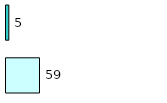
| Category | Series 0 | Series 1 |
|---|---|---|
| 0 | 59 | 5 |